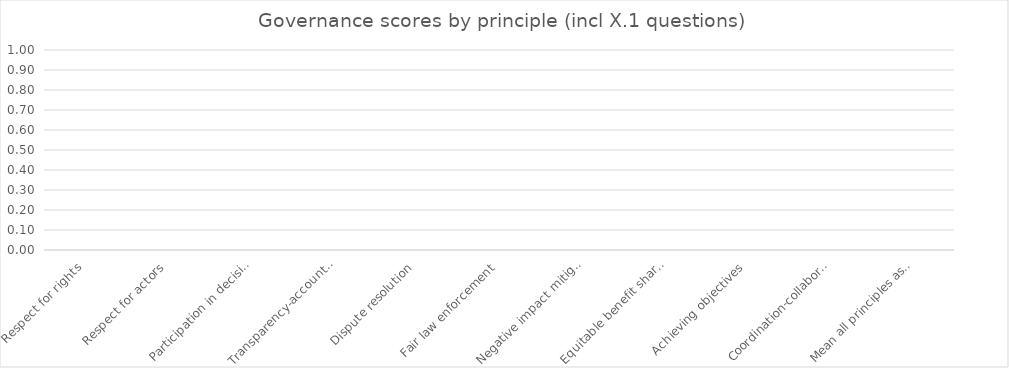
| Category | Mean |
|---|---|
| Respect for rights | 0 |
| Respect for actors | 0 |
| Participation in decisions | 0 |
| Transparency-accountability | 0 |
| Dispute resolution | 0 |
| Fair law enforcement | 0 |
| Negative impact mitigation | 0 |
| Equitable benefit sharing | 0 |
| Achieving objectives | 0 |
| Coordination-collaboration | 0 |
| Mean all principles assessed | 0 |